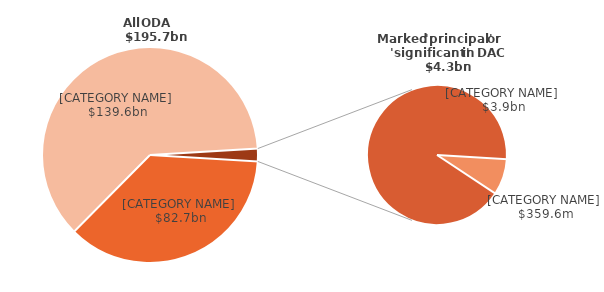
| Category | DAC-marked |
|---|---|
| Marked 'non-targeted' in DAC | 82.68 |
| Not marked in DAC | 139.642 |
| Contains inclusion keywords | 0.36 |
| No inclusion keywords | 3.945 |